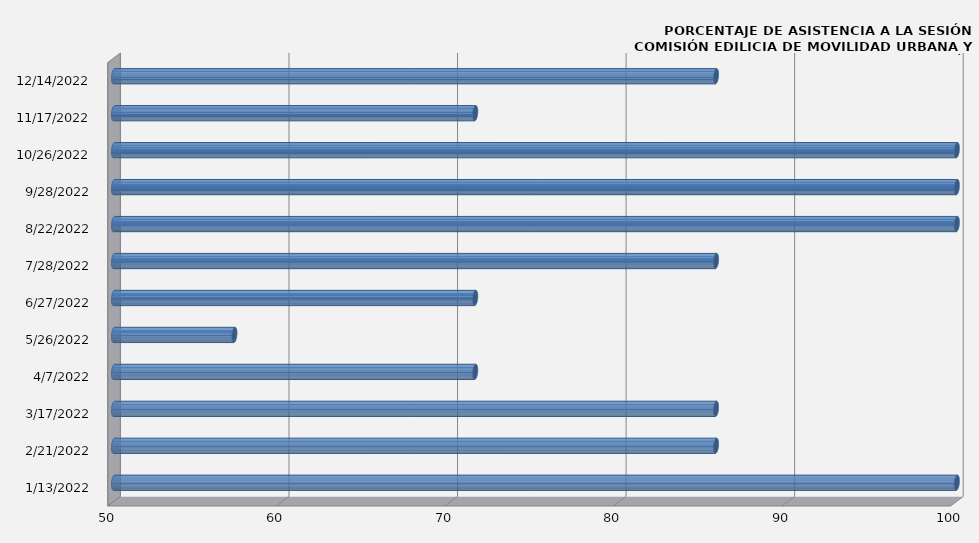
| Category | Series 0 |
|---|---|
| 1/13/22 | 100 |
| 2/21/22 | 85.714 |
| 3/17/22 | 85.714 |
| 4/7/22 | 71.429 |
| 5/26/22 | 57.143 |
| 6/27/22 | 71.429 |
| 7/28/22 | 85.714 |
| 8/22/22 | 100 |
| 9/28/22 | 100 |
| 10/26/22 | 100 |
| 11/17/22 | 71.429 |
| 12/14/22 | 85.714 |